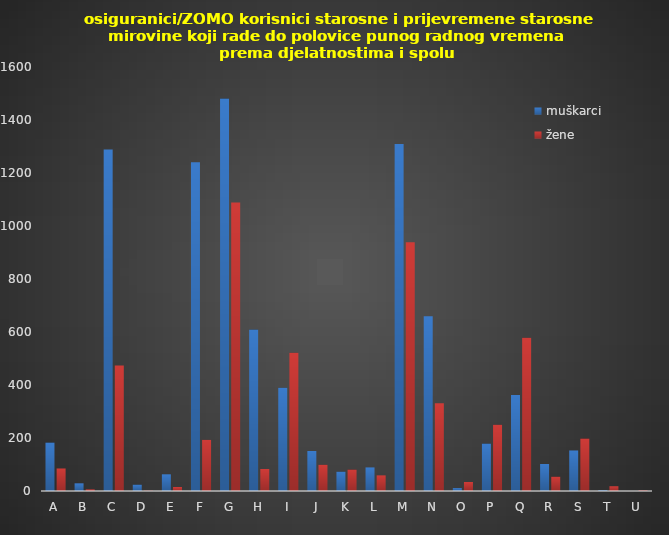
| Category | muškarci | žene |
|---|---|---|
| A | 183 | 85 |
| B | 29 | 6 |
| C | 1289 | 474 |
| D | 24 | 1 |
| E | 63 | 15 |
| F | 1241 | 193 |
| G | 1481 | 1089 |
| H | 609 | 83 |
| I | 390 | 522 |
| J | 151 | 99 |
| K | 73 | 81 |
| L | 89 | 59 |
| M | 1309 | 939 |
| N | 659 | 331 |
| O | 11 | 34 |
| P | 179 | 250 |
| Q | 362 | 578 |
| R | 102 | 54 |
| S | 153 | 198 |
| T | 3 | 18 |
| U | 0 | 2 |